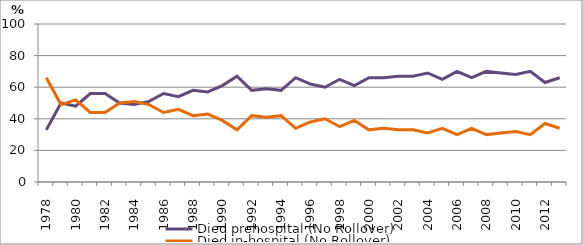
| Category | Died prehospital (No Rollover) | Died in-hospital (No Rollover) |
|---|---|---|
| 1978.0 | 33 | 66 |
| 1979.0 | 50 | 49 |
| 1980.0 | 48 | 52 |
| 1981.0 | 56 | 44 |
| 1982.0 | 56 | 44 |
| 1983.0 | 50 | 50 |
| 1984.0 | 49 | 51 |
| 1985.0 | 51 | 49 |
| 1986.0 | 56 | 44 |
| 1987.0 | 54 | 46 |
| 1988.0 | 58 | 42 |
| 1989.0 | 57 | 43 |
| 1990.0 | 61 | 39 |
| 1991.0 | 67 | 33 |
| 1992.0 | 58 | 42 |
| 1993.0 | 59 | 41 |
| 1994.0 | 58 | 42 |
| 1995.0 | 66 | 34 |
| 1996.0 | 62 | 38 |
| 1997.0 | 60 | 40 |
| 1998.0 | 65 | 35 |
| 1999.0 | 61 | 39 |
| 2000.0 | 66 | 33 |
| 2001.0 | 66 | 34 |
| 2002.0 | 67 | 33 |
| 2003.0 | 67 | 33 |
| 2004.0 | 69 | 31 |
| 2005.0 | 65 | 34 |
| 2006.0 | 70 | 30 |
| 2007.0 | 66 | 34 |
| 2008.0 | 70 | 30 |
| 2009.0 | 69 | 31 |
| 2010.0 | 68 | 32 |
| 2011.0 | 70 | 30 |
| 2012.0 | 63 | 37 |
| 2013.0 | 66 | 34 |